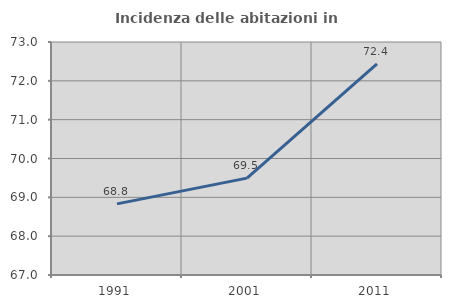
| Category | Incidenza delle abitazioni in proprietà  |
|---|---|
| 1991.0 | 68.831 |
| 2001.0 | 69.495 |
| 2011.0 | 72.438 |